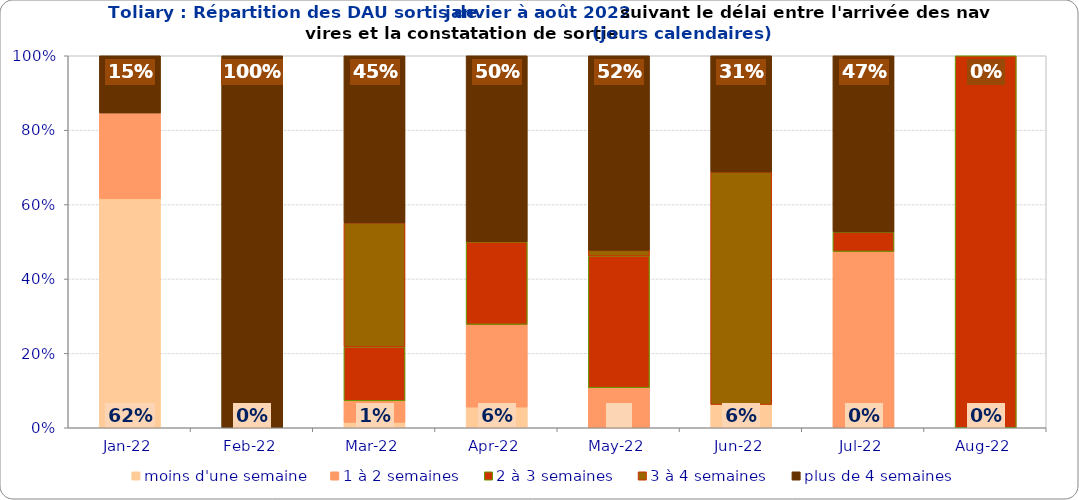
| Category | moins d'une semaine | 1 à 2 semaines | 2 à 3 semaines | 3 à 4 semaines | plus de 4 semaines |
|---|---|---|---|---|---|
| 2022-01-01 | 0.615 | 0.231 | 0 | 0 | 0.154 |
| 2022-02-01 | 0 | 0 | 0 | 0 | 1 |
| 2022-03-01 | 0.014 | 0.058 | 0.145 | 0.333 | 0.449 |
| 2022-04-01 | 0.056 | 0.222 | 0.222 | 0 | 0.5 |
| 2022-05-01 | 0 | 0.108 | 0.354 | 0.015 | 0.523 |
| 2022-06-01 | 0.062 | 0 | 0 | 0.625 | 0.312 |
| 2022-07-01 | 0 | 0.474 | 0.053 | 0 | 0.474 |
| 2022-08-01 | 0 | 0 | 1 | 0 | 0 |